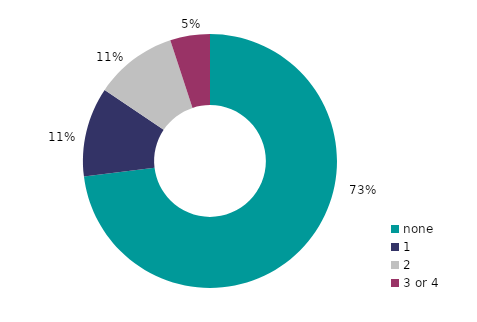
| Category | percentage of dwellings |
|---|---|
| none | 73.043 |
| 1 | 11.392 |
| 2 | 10.503 |
| 3 or 4 | 5.061 |